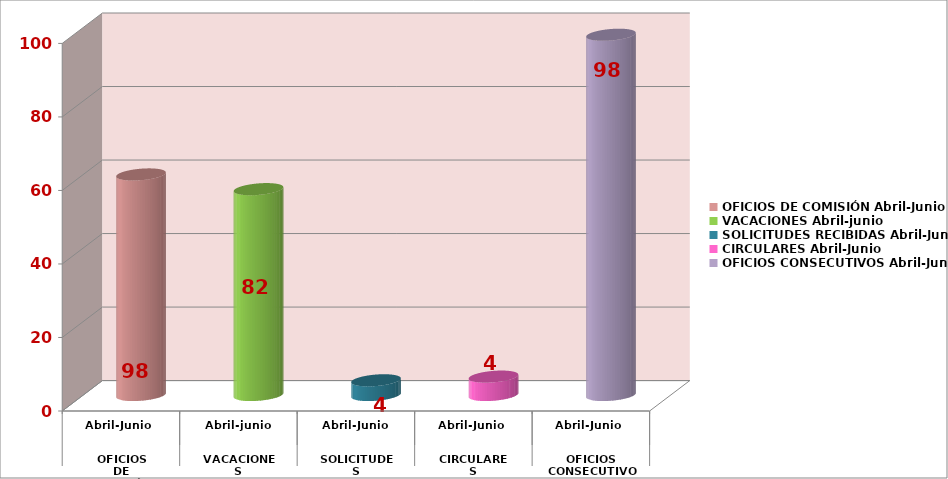
| Category | Series 0 |
|---|---|
| 0 | 60 |
| 1 | 56 |
| 2 | 4 |
| 3 | 5 |
| 4 | 98 |